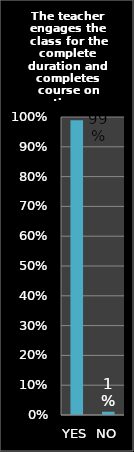
| Category | Series 0 |
|---|---|
| YES | 0.989 |
| NO | 0.011 |